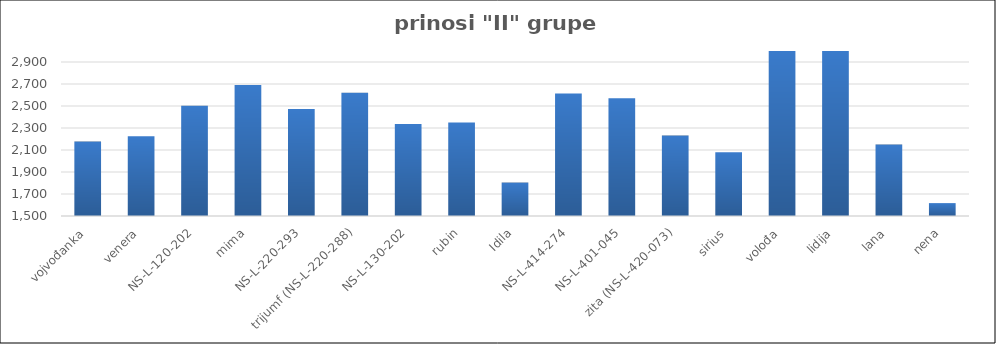
| Category | Series 0 |
|---|---|
| vojvođanka | 2176.988 |
| venera | 2225.3 |
| NS-L-120-202 | 2502.95 |
| mima | 2690.633 |
| NS-L-220-293 | 2473.5 |
| trijumf (NS-L-220-288) | 2621.567 |
| NS-L-130-202 | 2335.5 |
| rubin | 2350.145 |
| Idila | 1804.226 |
| NS-L-414-274 | 2613.821 |
| NS-L-401-045 | 2570.741 |
| zita (NS-L-420-073) | 2231 |
| sirius | 2080 |
| volođa | 3686.178 |
| lidija | 3686.6 |
| lana | 2149.1 |
| nena | 1617.2 |